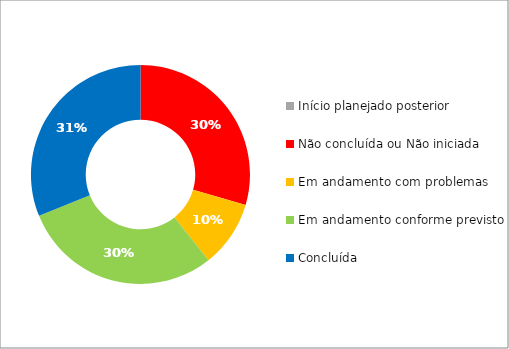
| Category | Series 0 |
|---|---|
| Início planejado posterior | 0 |
| Não concluída ou Não iniciada | 18 |
| Em andamento com problemas | 6 |
| Em andamento conforme previsto | 18 |
| Concluída | 19 |